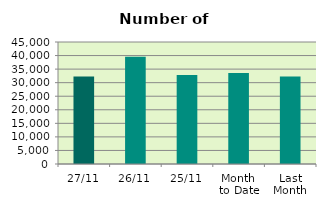
| Category | Series 0 |
|---|---|
| 27/11 | 32318 |
| 26/11 | 39544 |
| 25/11 | 32806 |
| Month 
to Date | 33552.842 |
| Last
Month | 32305.043 |